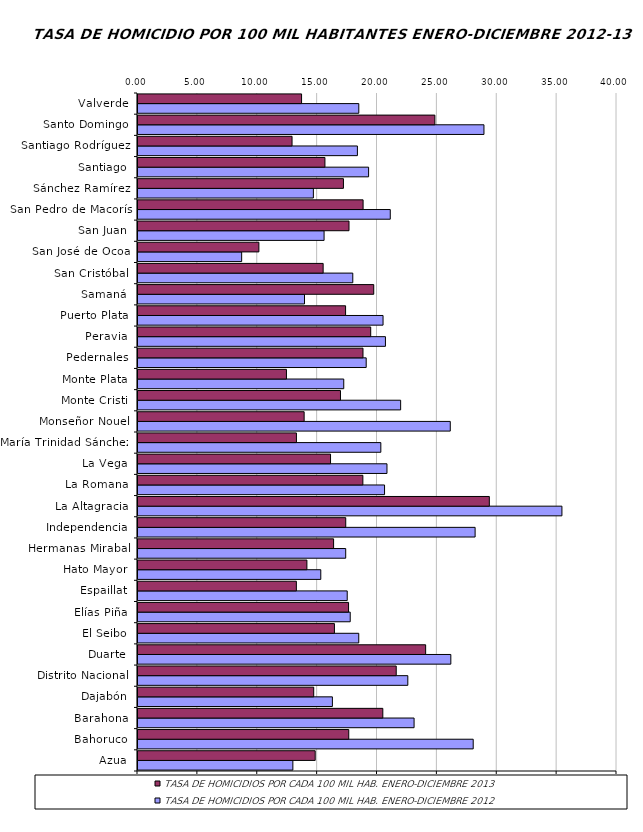
| Category | TASA DE HOMICIDIOS POR CADA 100 MIL HAB. ENERO-DICIEMBRE 2012 | TASA DE HOMICIDIOS POR CADA 100 MIL HAB. ENERO-DICIEMBRE 2013 |
|---|---|---|
| Azua | 12.933 | 14.798 |
| Bahoruco | 27.992 | 17.599 |
| Barahona | 23.055 | 20.444 |
| Dajabón | 16.233 | 14.674 |
| Distrito Nacional | 22.532 | 21.564 |
| Duarte | 26.124 | 24.02 |
| El Seibo | 18.435 | 16.403 |
| Elías Piña | 17.723 | 17.583 |
| Espaillat | 17.472 | 13.225 |
| Hato Mayor | 15.264 | 14.104 |
| Hermanas Mirabal | 17.345 | 16.334 |
| Independencia | 28.151 | 17.348 |
| La Altagracia | 35.401 | 29.339 |
| La Romana | 20.589 | 18.777 |
| La Vega | 20.791 | 16.078 |
| María Trinidad Sánchez | 20.279 | 13.23 |
| Monseñor Nouel | 26.078 | 13.874 |
| Monte Cristi | 21.933 | 16.909 |
| Monte Plata | 17.182 | 12.396 |
| Pedernales | 19.056 | 18.789 |
| Peravia | 20.663 | 19.433 |
| Puerto Plata | 20.464 | 17.334 |
| Samaná | 13.904 | 19.687 |
| San Cristóbal | 17.936 | 15.461 |
| San José de Ocoa | 8.657 | 10.095 |
| San Juan | 15.539 | 17.621 |
| San Pedro de Macorís | 21.067 | 18.797 |
| Sánchez Ramírez | 14.646 | 17.157 |
| Santiago | 19.257 | 15.611 |
| Santiago Rodríguez | 18.323 | 12.864 |
| Santo Domingo | 28.89 | 24.791 |
| Valverde | 18.439 | 13.659 |